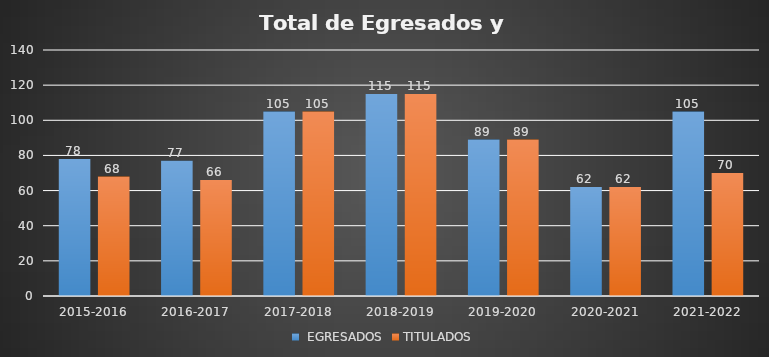
| Category |  EGRESADOS | TITULADOS |
|---|---|---|
| 2015-2016 | 78 | 68 |
| 2016-2017 | 77 | 66 |
| 2017-2018 | 105 | 105 |
| 2018-2019 | 115 | 115 |
| 2019-2020 | 89 | 89 |
| 2020-2021 | 62 | 62 |
| 2021-2022 | 105 | 70 |